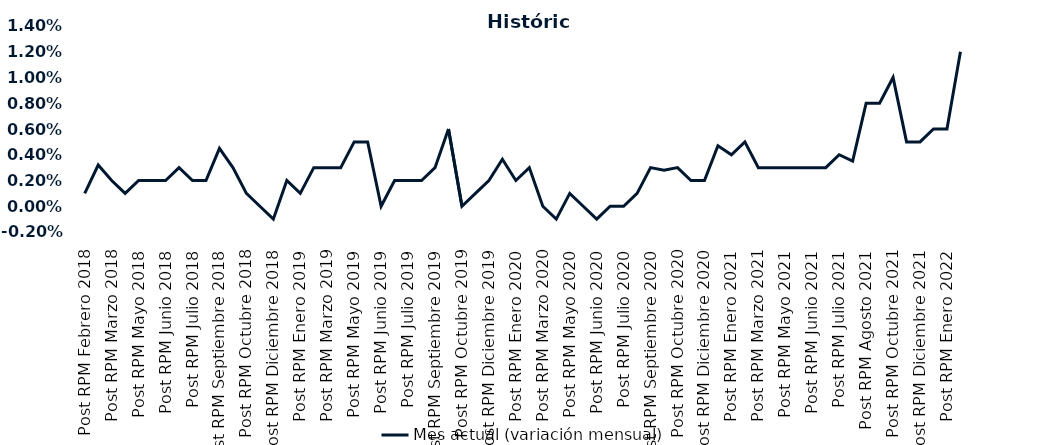
| Category | Mes actual (variación mensual)  |
|---|---|
| Post RPM Febrero 2018 | 0.001 |
| Pre RPM Marzo 2018 | 0.003 |
| Post RPM Marzo 2018 | 0.002 |
| Pre RPM Mayo 2018 | 0.001 |
| Post RPM Mayo 2018 | 0.002 |
| Pre RPM Junio 2018 | 0.002 |
| Post RPM Junio 2018 | 0.002 |
| Pre RPM Julio 2018 | 0.003 |
| Post RPM Julio 2018 | 0.002 |
| Pre RPM Septiembre 2018 | 0.002 |
| Post RPM Septiembre 2018 | 0.004 |
| Pre RPM Octubre 2018 | 0.003 |
| Post RPM Octubre 2018 | 0.001 |
| Pre RPM Diciembre 2018 | 0 |
| Post RPM Diciembre 2018 | -0.001 |
| Pre RPM Enero 2019 | 0.002 |
| Post RPM Enero 2019 | 0.001 |
| Pre RPM Marzo 2019 | 0.003 |
| Post RPM Marzo 2019 | 0.003 |
| Pre RPM Mayo 2019 | 0.003 |
| Post RPM Mayo 2019 | 0.005 |
| Pre RPM Junio 2019 | 0.005 |
| Post RPM Junio 2019 | 0 |
| Pre RPM Julio 2019 | 0.002 |
| Post RPM Julio 2019 | 0.002 |
| Pre RPM Septiembre 2019 | 0.002 |
| Post RPM Septiembre 2019 | 0.003 |
| Pre RPM Octubre 2019 | 0.006 |
| Post RPM Octubre 2019 | 0 |
| Pre RPM Diciembre 2019 | 0.001 |
| Post RPM Diciembre 2019 | 0.002 |
| Pre RPM Enero 2020 | 0.004 |
| Post RPM Enero 2020 | 0.002 |
| Pre RPM Marzo 2020 | 0.003 |
| Post RPM Marzo 2020 | 0 |
| Pre RPM Mayo 2020 | -0.001 |
| Post RPM Mayo 2020 | 0.001 |
| Pre RPM Junio 2020 | 0 |
| Post RPM Junio 2020 | -0.001 |
| Pre RPM Julio 2020 | 0 |
| Post RPM Julio 2020 | 0 |
| Pre RPM Septiembre 2020 | 0.001 |
| Post RPM Septiembre 2020 | 0.003 |
| Pre RPM Octubre 2020 | 0.003 |
| Post RPM Octubre 2020 | 0.003 |
| Pre RPM Diciembre 2020 | 0.002 |
| Post RPM Diciembre 2020 | 0.002 |
| Pre RPM Enero 2021 | 0.005 |
| Post RPM Enero 2021 | 0.004 |
| Pre RPM Marzo 2021 | 0.005 |
| Post RPM Marzo 2021 | 0.003 |
| Pre RPM Mayo 2021 | 0.003 |
| Post RPM Mayo 2021 | 0.003 |
| Pre RPM Junio 2021 | 0.003 |
| Post RPM Junio 2021 | 0.003 |
| Pre RPM Julio 2021 | 0.003 |
| Post RPM Julio 2021 | 0.004 |
| Pre RPM Agosto 2021 | 0.004 |
| Post RPM Agosto 2021 | 0.008 |
| Pre RPM Octubre 2021 | 0.008 |
| Post RPM Octubre 2021 | 0.01 |
| Pre RPM Diciembre 2021 | 0.005 |
| Post RPM Diciembre 2021 | 0.005 |
| Pre RPM Enero 2022 | 0.006 |
| Post RPM Enero 2022 | 0.006 |
| Pre RPM Marzo 2022 | 0.012 |